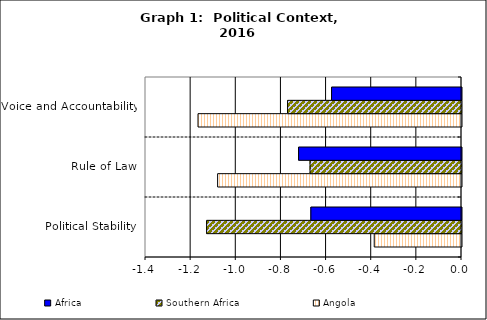
| Category | Angola | Southern Africa | Africa |
|---|---|---|---|
| Political Stability | -0.387 | -1.129 | -0.667 |
| Rule of Law | -1.081 | -0.671 | -0.722 |
| Voice and Accountability | -1.167 | -0.771 | -0.576 |